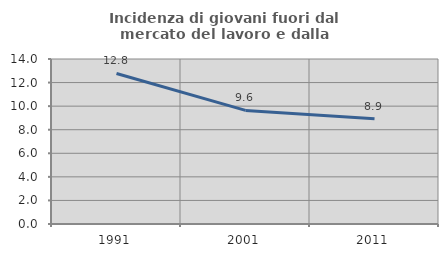
| Category | Incidenza di giovani fuori dal mercato del lavoro e dalla formazione  |
|---|---|
| 1991.0 | 12.775 |
| 2001.0 | 9.639 |
| 2011.0 | 8.929 |